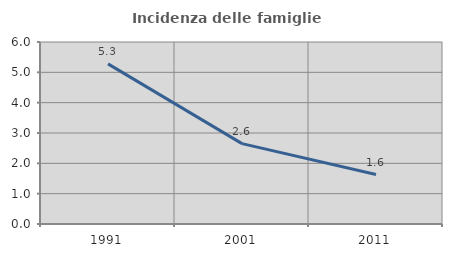
| Category | Incidenza delle famiglie numerose |
|---|---|
| 1991.0 | 5.278 |
| 2001.0 | 2.649 |
| 2011.0 | 1.63 |